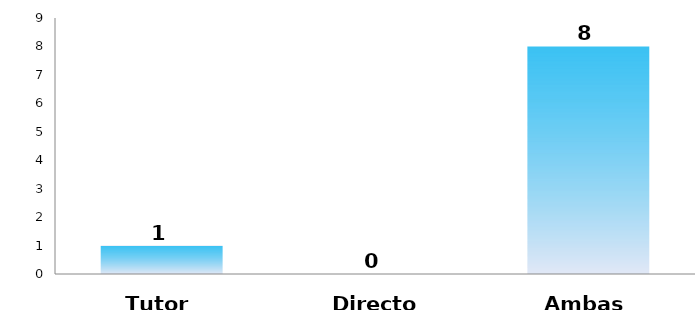
| Category | Series 0 |
|---|---|
| Tutor | 1 |
| Director | 0 |
| Ambas | 8 |